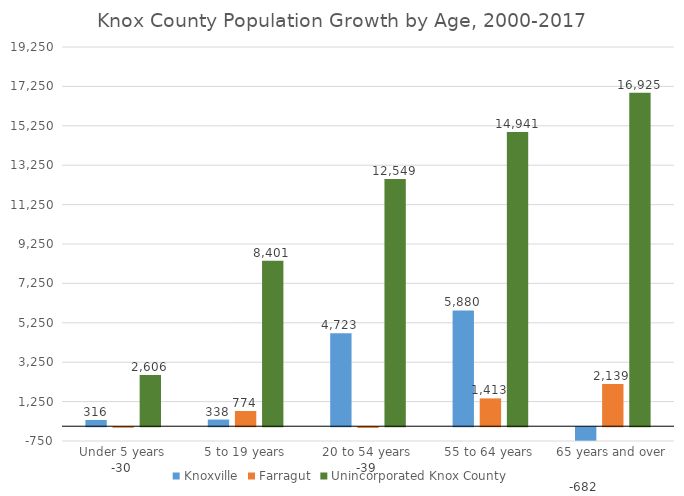
| Category | Knoxville | Farragut | Unincorporated Knox County |
|---|---|---|---|
| Under 5 years | 316 | -30 | 2606 |
| 5 to 19 years | 338 | 774 | 8401 |
| 20 to 54 years | 4723 | -39 | 12549 |
| 55 to 64 years | 5880 | 1413 | 14941 |
| 65 years and over | -682 | 2139 | 16925 |